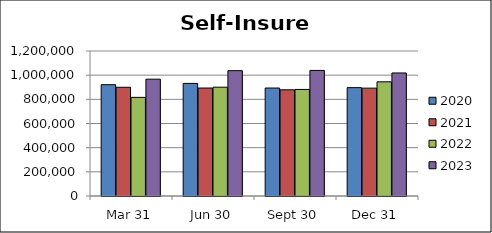
| Category | 2020 | 2021 | 2022 | 2023 |
|---|---|---|---|---|
| Mar 31 | 921215 | 899834 | 816287 | 966876 |
| Jun 30 | 931824 | 893551 | 900396 | 1037338 |
| Sept 30 | 893632 | 878748 | 881814 | 1039286 |
| Dec 31 | 896802 | 892723 | 944912 | 1018284 |